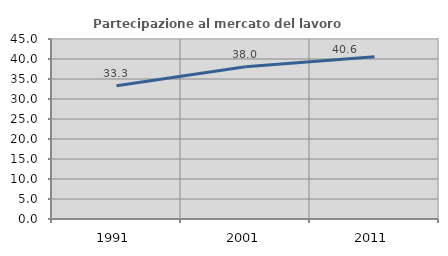
| Category | Partecipazione al mercato del lavoro  femminile |
|---|---|
| 1991.0 | 33.333 |
| 2001.0 | 38.035 |
| 2011.0 | 40.556 |